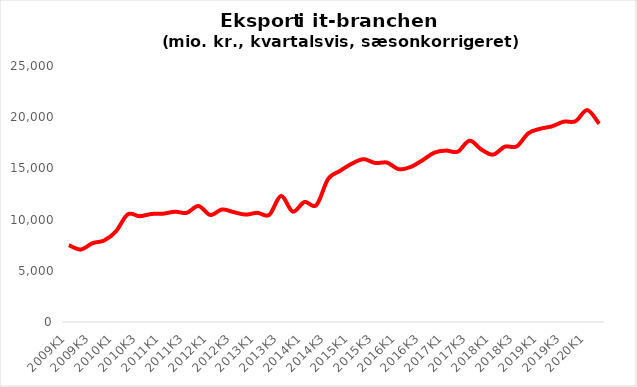
| Category | Samlet eksport i It-branchen |
|---|---|
| 2009K1 | 7501.908 |
| 2009K2 | 7080.391 |
| 2009K3 | 7694.982 |
| 2009K4 | 7964.407 |
| 2010K1 | 8858.226 |
| 2010K2 | 10519.552 |
| 2010K3 | 10330.544 |
| 2010K4 | 10546.987 |
| 2011K1 | 10577.507 |
| 2011K2 | 10769.435 |
| 2011K3 | 10659.791 |
| 2011K4 | 11325.162 |
| 2012K1 | 10452.293 |
| 2012K2 | 10990.659 |
| 2012K3 | 10723.966 |
| 2012K4 | 10486.622 |
| 2013K1 | 10662.838 |
| 2013K2 | 10457.056 |
| 2013K3 | 12303.356 |
| 2013K4 | 10781.069 |
| 2014K1 | 11720.487 |
| 2014K2 | 11402.448 |
| 2014K3 | 13961.891 |
| 2014K4 | 14751.307 |
| 2015K1 | 15451.58 |
| 2015K2 | 15903.267 |
| 2015K3 | 15526.266 |
| 2015K4 | 15567.512 |
| 2016K1 | 14918.795 |
| 2016K2 | 15139.254 |
| 2016K3 | 15791.343 |
| 2016K4 | 16527.2 |
| 2017K1 | 16743.332 |
| 2017K2 | 16627.564 |
| 2017K3 | 17709.745 |
| 2017K4 | 16846.627 |
| 2018K1 | 16345.716 |
| 2018K2 | 17124.593 |
| 2018K3 | 17148.14 |
| 2018K4 | 18434.541 |
| 2019K1 | 18870.685 |
| 2019K2 | 19110.69 |
| 2019K3 | 19564.114 |
| 2019K4 | 19607.884 |
| 2020K1 | 20692.629 |
| 2020K2 | 19361.327 |